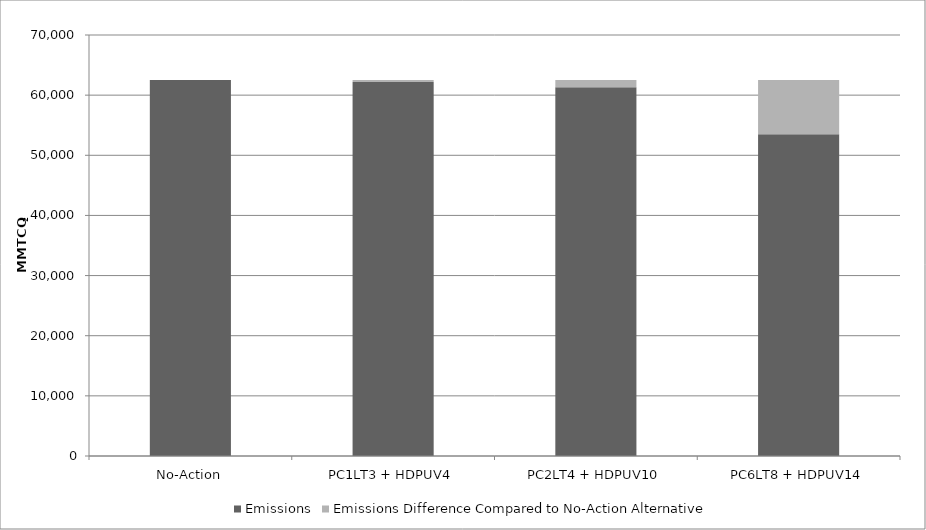
| Category | Emissions | Emissions Difference Compared to No-Action Alternative |
|---|---|---|
| No-Action | 62500 | 0 |
| PC1LT3 + HDPUV4 | 62200 | 300 |
| PC2LT4 + HDPUV10 | 61300 | 1200 |
| PC6LT8 + HDPUV14 | 53500 | 9000 |